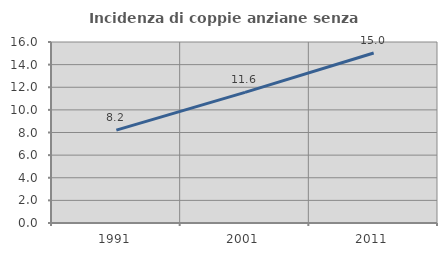
| Category | Incidenza di coppie anziane senza figli  |
|---|---|
| 1991.0 | 8.214 |
| 2001.0 | 11.551 |
| 2011.0 | 15.031 |